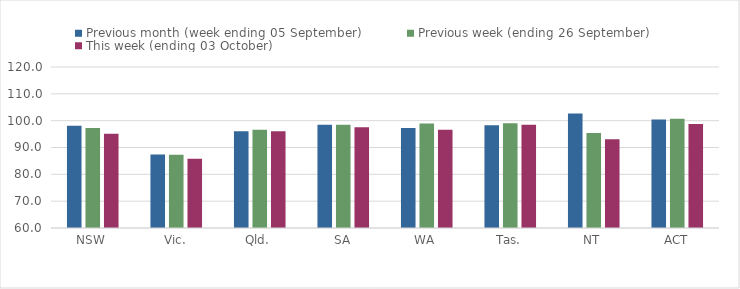
| Category | Previous month (week ending 05 September) | Previous week (ending 26 September) | This week (ending 03 October) |
|---|---|---|---|
| NSW | 98.1 | 97.23 | 95.15 |
| Vic. | 87.42 | 87.32 | 85.82 |
| Qld. | 96.07 | 96.59 | 96.1 |
| SA | 98.48 | 98.48 | 97.59 |
| WA | 97.26 | 98.98 | 96.6 |
| Tas. | 98.32 | 99.02 | 98.51 |
| NT | 102.69 | 95.44 | 93.04 |
| ACT | 100.41 | 100.68 | 98.8 |